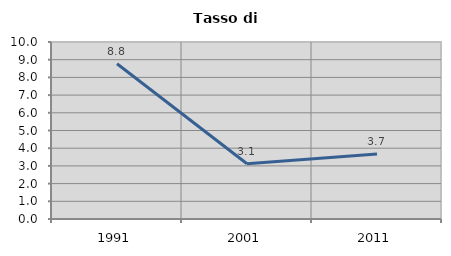
| Category | Tasso di disoccupazione   |
|---|---|
| 1991.0 | 8.768 |
| 2001.0 | 3.12 |
| 2011.0 | 3.667 |